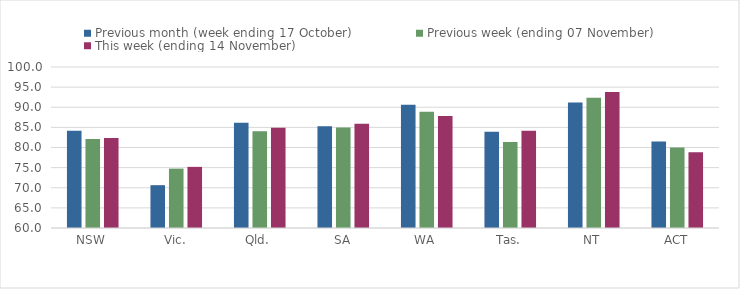
| Category | Previous month (week ending 17 October) | Previous week (ending 07 November) | This week (ending 14 November) |
|---|---|---|---|
| NSW | 84.18 | 82.1 | 82.39 |
| Vic. | 70.64 | 74.75 | 75.19 |
| Qld. | 86.17 | 84.05 | 84.93 |
| SA | 85.28 | 84.94 | 85.89 |
| WA | 90.65 | 88.86 | 87.81 |
| Tas. | 83.91 | 81.39 | 84.17 |
| NT | 91.15 | 92.34 | 93.77 |
| ACT | 81.48 | 79.99 | 78.84 |